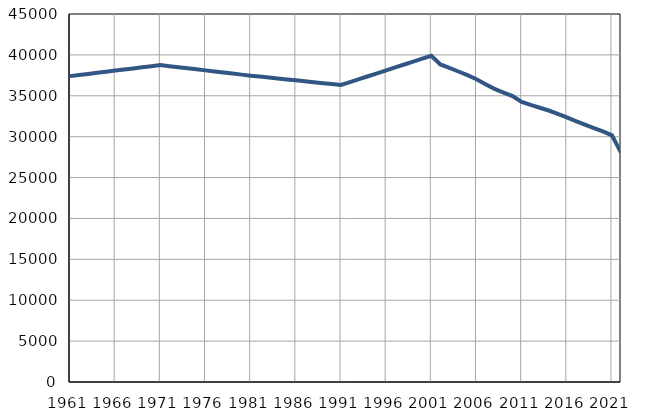
| Category | Population
size |
|---|---|
| 1961.0 | 37403 |
| 1962.0 | 37538 |
| 1963.0 | 37673 |
| 1964.0 | 37808 |
| 1965.0 | 37943 |
| 1966.0 | 38078 |
| 1967.0 | 38212 |
| 1968.0 | 38347 |
| 1969.0 | 38482 |
| 1970.0 | 38617 |
| 1971.0 | 38752 |
| 1972.0 | 38623 |
| 1973.0 | 38493 |
| 1974.0 | 38364 |
| 1975.0 | 38235 |
| 1976.0 | 38106 |
| 1977.0 | 37976 |
| 1978.0 | 37847 |
| 1979.0 | 37718 |
| 1980.0 | 37588 |
| 1981.0 | 37459 |
| 1982.0 | 37345 |
| 1983.0 | 37231 |
| 1984.0 | 37116 |
| 1985.0 | 37002 |
| 1986.0 | 36888 |
| 1987.0 | 36775 |
| 1988.0 | 36660 |
| 1989.0 | 36545 |
| 1990.0 | 36431 |
| 1991.0 | 36317 |
| 1992.0 | 36675 |
| 1993.0 | 37033 |
| 1994.0 | 37391 |
| 1995.0 | 37749 |
| 1996.0 | 38107 |
| 1997.0 | 38465 |
| 1998.0 | 38823 |
| 1999.0 | 39181 |
| 2000.0 | 39539 |
| 2001.0 | 39897 |
| 2002.0 | 38835 |
| 2003.0 | 38410 |
| 2004.0 | 37968 |
| 2005.0 | 37522 |
| 2006.0 | 37024 |
| 2007.0 | 36423 |
| 2008.0 | 35845 |
| 2009.0 | 35390 |
| 2010.0 | 34957 |
| 2011.0 | 34261 |
| 2012.0 | 33877 |
| 2013.0 | 33540 |
| 2014.0 | 33200 |
| 2015.0 | 32799 |
| 2016.0 | 32348 |
| 2017.0 | 31901 |
| 2018.0 | 31467 |
| 2019.0 | 31053 |
| 2020.0 | 30643 |
| 2021.0 | 30153 |
| 2022.0 | 28041 |